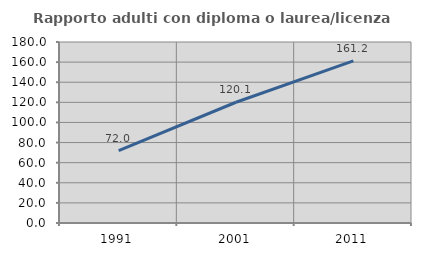
| Category | Rapporto adulti con diploma o laurea/licenza media  |
|---|---|
| 1991.0 | 72.009 |
| 2001.0 | 120.089 |
| 2011.0 | 161.219 |